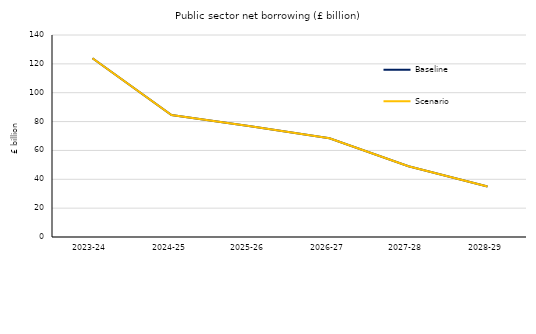
| Category | Baseline | Scenario |
|---|---|---|
| 2023-24 | 123.91 | 123.91 |
| 2024-25 | 84.57 | 84.57 |
| 2025-26 | 76.836 | 76.836 |
| 2026-27 | 68.406 | 68.406 |
| 2027-28 | 49.059 | 49.059 |
| 2028-29 | 35.004 | 35.004 |